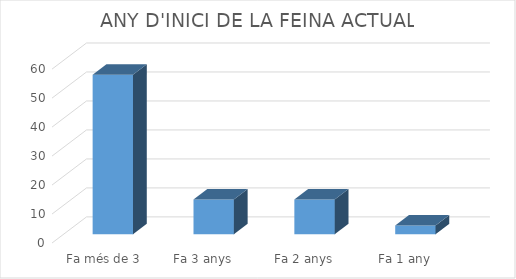
| Category | Series 0 |
|---|---|
| Fa més de 3 anys | 55 |
| Fa 3 anys | 12 |
| Fa 2 anys | 12 |
| Fa 1 any | 3 |